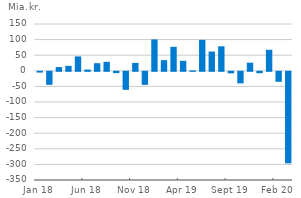
| Category | Afkast |
|---|---|
| 2018-01-01 | -2.52 |
| 2018-02-01 | -41.7 |
| 2018-03-01 | 11.92 |
| 2018-04-01 | 15.76 |
| 2018-05-01 | 46.13 |
| 2018-06-01 | 3.97 |
| 2018-07-01 | 24.37 |
| 2018-08-01 | 28.79 |
| 2018-09-01 | -4.24 |
| 2018-10-01 | -57.75 |
| 2018-11-01 | 25.26 |
| 2018-12-01 | -41.78 |
| 2019-01-01 | 100.57 |
| 2019-02-01 | 34.22 |
| 2019-03-01 | 76.8 |
| 2019-04-01 | 31.98 |
| 2019-05-01 | 1.37 |
| 2019-06-01 | 99.15 |
| 2019-07-01 | 61.58 |
| 2019-08-01 | 78.49 |
| 2019-09-01 | -5.01 |
| 2019-10-01 | -37.18 |
| 2019-11-01 | 25.96 |
| 2019-12-01 | -4.55 |
| 2020-01-01 | 67.42 |
| 2020-02-01 | -32.03 |
| 2020-03-01 | -293.32 |